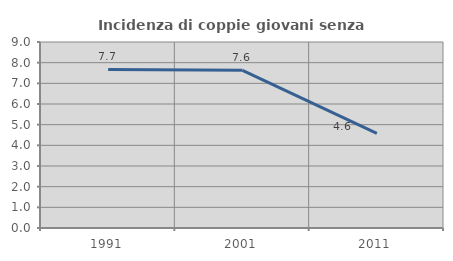
| Category | Incidenza di coppie giovani senza figli |
|---|---|
| 1991.0 | 7.671 |
| 2001.0 | 7.631 |
| 2011.0 | 4.577 |